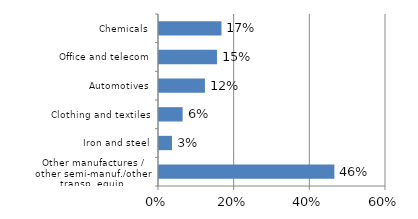
| Category | Series 0 |
|---|---|
| Other manufactures / other semi-manuf./other transp. equip. | 0.463 |
| Iron and steel | 0.034 |
| Clothing and textiles | 0.062 |
| Automotives | 0.121 |
| Office and telecom | 0.153 |
| Chemicals | 0.165 |